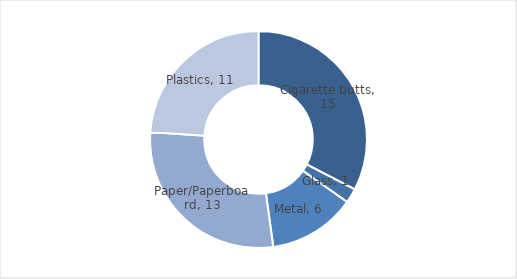
| Category | Series 0 |
|---|---|
| Cigarette butts | 15 |
| Glass | 1 |
| Metal | 6 |
| Paper/Paperboard | 13 |
| Plastics | 11 |